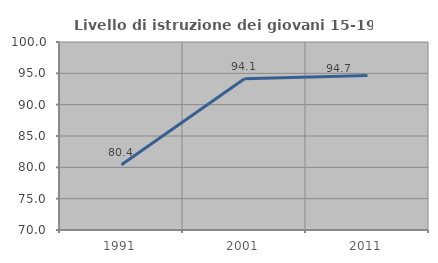
| Category | Livello di istruzione dei giovani 15-19 anni |
|---|---|
| 1991.0 | 80.419 |
| 2001.0 | 94.124 |
| 2011.0 | 94.673 |